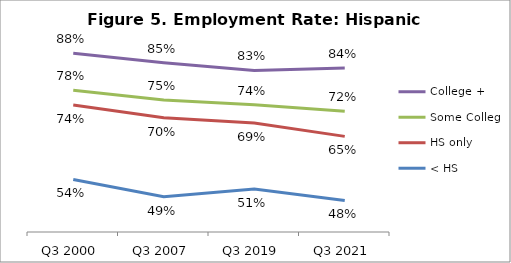
| Category | College + | Some College | HS only | < HS |
|---|---|---|---|---|
| Q3 2000 | 0.875 | 0.777 | 0.737 | 0.54 |
| Q3 2007 | 0.85 | 0.751 | 0.704 | 0.494 |
| Q3 2019 | 0.83 | 0.739 | 0.69 | 0.514 |
| Q3 2021 | 0.836 | 0.721 | 0.654 | 0.484 |